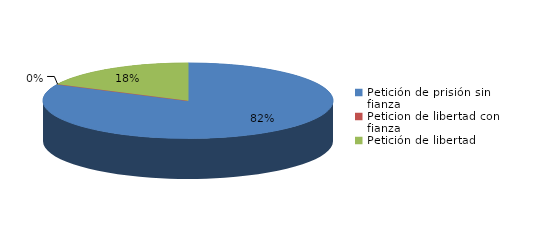
| Category | Series 0 |
|---|---|
| Petición de prisión sin fianza | 97 |
| Peticion de libertad con fianza | 0 |
| Petición de libertad | 21 |